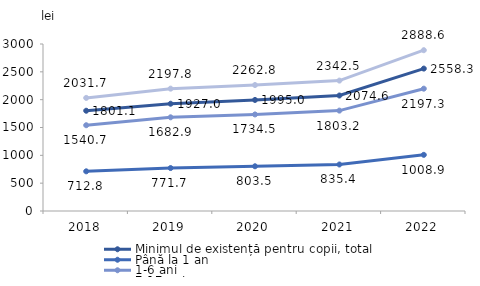
| Category | Minimul de existență pentru copii, total | Până la 1 an | 1-6 ani | 7-17 ani |
|---|---|---|---|---|
| 2018.0 | 1801.1 | 712.8 | 1540.7 | 2031.7 |
| 2019.0 | 1927 | 771.7 | 1682.9 | 2197.8 |
| 2020.0 | 1995 | 803.5 | 1734.5 | 2262.8 |
| 2021.0 | 2074.6 | 835.4 | 1803.2 | 2342.5 |
| 2022.0 | 2558.3 | 1008.9 | 2197.3 | 2888.6 |